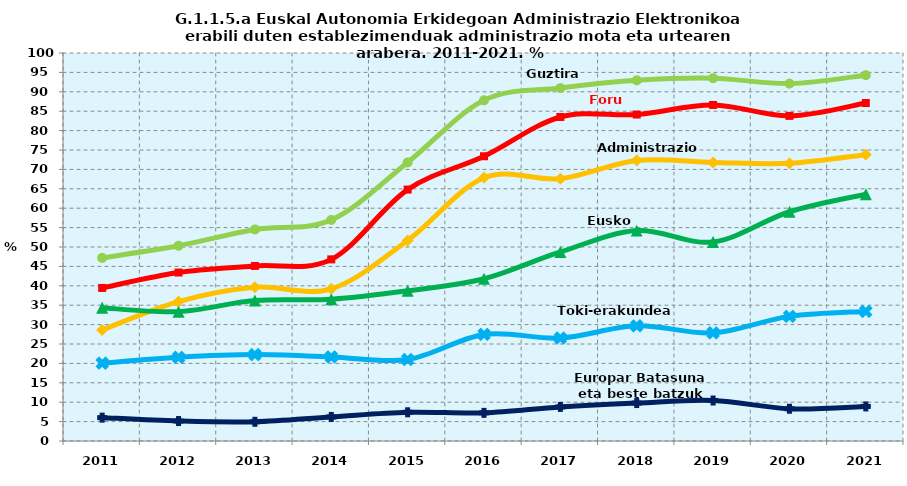
| Category | Guztira | Foru aldundiak | Administrazio Zentrala | Eusko Jaurlaritza | Toki-erakundeak | Europar Batasuna eta beste batzuk |
|---|---|---|---|---|---|---|
| 2011.0 | 47.195 | 39.446 | 28.619 | 34.347 | 20.063 | 6.017 |
| 2012.0 | 50.321 | 43.417 | 35.926 | 33.339 | 21.568 | 5.144 |
| 2013.0 | 54.524 | 45.118 | 39.622 | 36.207 | 22.264 | 4.948 |
| 2014.0 | 56.986 | 46.807 | 39.221 | 36.539 | 21.658 | 6.198 |
| 2015.0 | 71.8 | 64.8 | 51.7 | 38.7 | 21 | 7.4 |
| 2016.0 | 87.813 | 73.385 | 67.853 | 41.82 | 27.461 | 7.249 |
| 2017.0 | 90.959 | 83.514 | 67.612 | 48.718 | 26.543 | 8.784 |
| 2018.0 | 92.961 | 84.142 | 72.311 | 54.229 | 29.694 | 9.782 |
| 2019.0 | 93.517 | 86.609 | 71.787 | 51.305 | 27.87 | 10.432 |
| 2020.0 | 92.114 | 83.794 | 71.565 | 59.083 | 32.123 | 8.311 |
| 2021.0 | 94.294 | 87.114 | 73.798 | 63.597 | 33.395 | 8.911 |